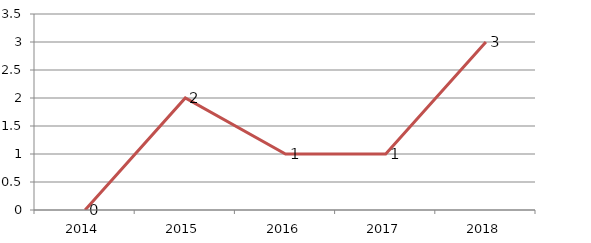
| Category | Total |
|---|---|
| 2014.0 | 0 |
| 2015.0 | 2 |
| 2016.0 | 1 |
| 2017.0 | 1 |
| 2018.0 | 3 |